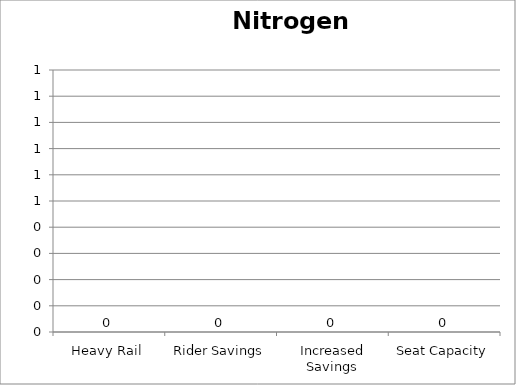
| Category | Nitrogen Oxides |
|---|---|
| Heavy Rail | 0 |
| Rider Savings | 0 |
| Increased Savings | 0 |
| Seat Capacity | 0 |